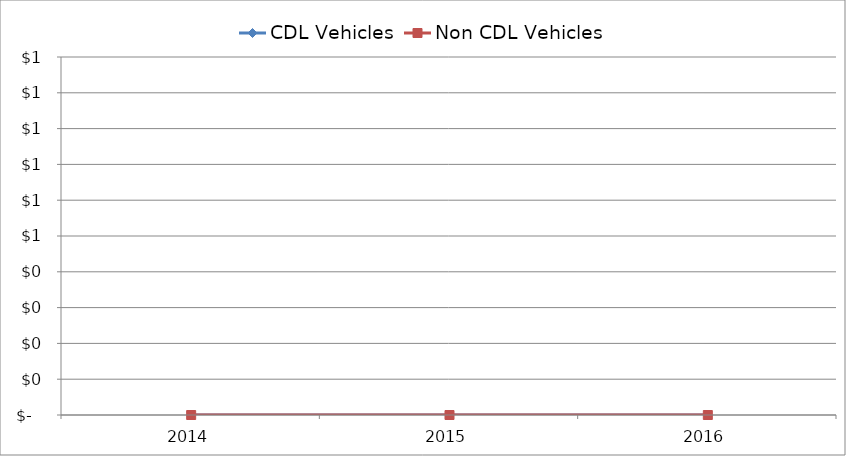
| Category | CDL Vehicles | Non CDL Vehicles |
|---|---|---|
| 2014 | 0 | 0 |
| 2015 | 0 | 0 |
| 2016 | 0 | 0 |